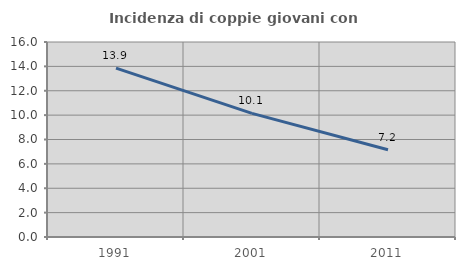
| Category | Incidenza di coppie giovani con figli |
|---|---|
| 1991.0 | 13.851 |
| 2001.0 | 10.145 |
| 2011.0 | 7.162 |